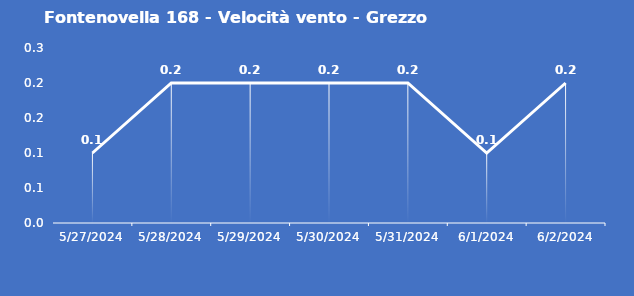
| Category | Fontenovella 168 - Velocità vento - Grezzo (m/s) |
|---|---|
| 5/27/24 | 0.1 |
| 5/28/24 | 0.2 |
| 5/29/24 | 0.2 |
| 5/30/24 | 0.2 |
| 5/31/24 | 0.2 |
| 6/1/24 | 0.1 |
| 6/2/24 | 0.2 |